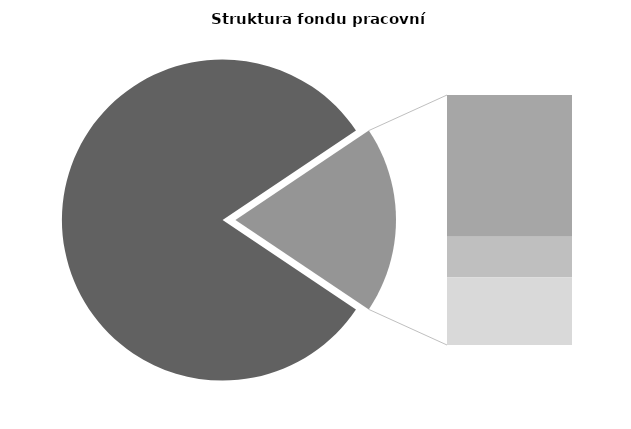
| Category | Series 0 |
|---|---|
| Průměrná měsíční 
odpracovaná doba  
bez přesčasu | 139.32 |
| Dovolená | 18.277 |
| Nemoc | 5.226 |
| Jiné | 8.749 |